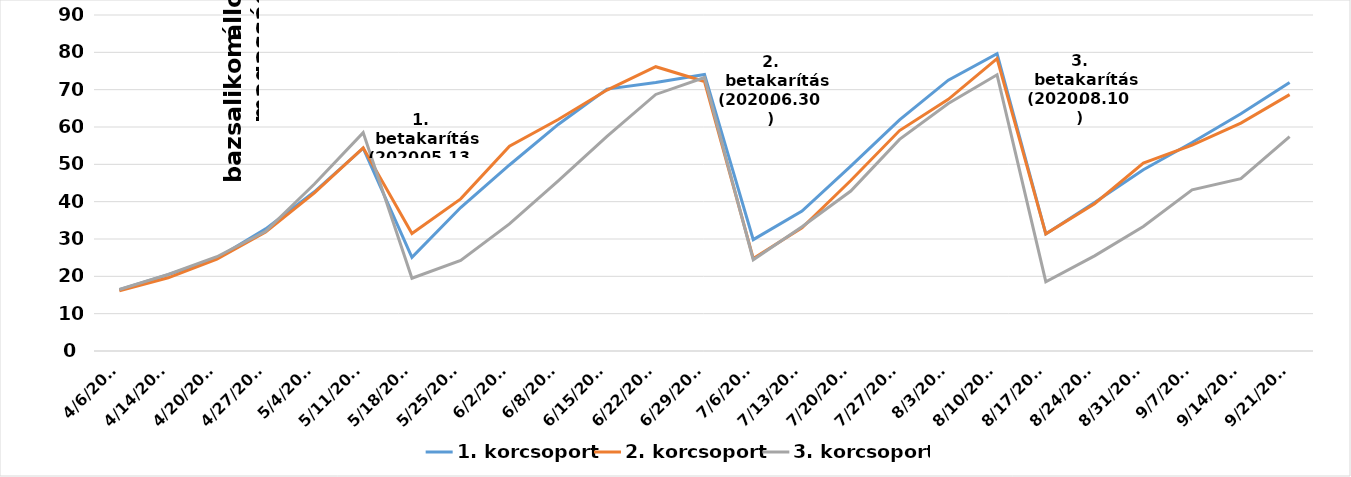
| Category | 1. korcsoport | 2. korcsoport | 3. korcsoport |
|---|---|---|---|
| 4/6/20 | 16.415 | 16.102 | 16.463 |
| 4/14/20 | 20.47 | 19.61 | 20.513 |
| 4/20/20 | 24.86 | 24.628 | 25.253 |
| 4/27/20 | 32.72 | 31.862 | 32.045 |
| 5/4/20 | 42.643 | 42.345 | 44.72 |
| 5/11/20 | 54.33 | 54.427 | 58.487 |
| 5/18/20 | 25.088 | 31.46 | 19.488 |
| 5/25/20 | 38.425 | 40.753 | 24.262 |
| 6/2/20 | 49.828 | 54.85 | 34.052 |
| 6/8/20 | 60.682 | 61.998 | 45.575 |
| 6/15/20 | 70.16 | 69.902 | 57.47 |
| 6/22/20 | 71.915 | 76.15 | 68.718 |
| 6/29/20 | 74.088 | 72.18 | 73.242 |
| 7/6/20 | 29.825 | 24.8 | 24.45 |
| 7/13/20 | 37.468 | 33.018 | 33.278 |
| 7/20/20 | 49.5 | 45.675 | 42.85 |
| 7/27/20 | 61.9 | 59.05 | 56.675 |
| 8/3/20 | 72.535 | 67.425 | 66.305 |
| 8/10/20 | 79.643 | 78.305 | 73.983 |
| 8/17/20 | 31.342 | 31.385 | 18.558 |
| 8/24/20 | 39.808 | 39.457 | 25.475 |
| 8/31/20 | 48.555 | 50.358 | 33.367 |
| 9/7/20 | 55.852 | 55.125 | 43.157 |
| 9/14/20 | 63.545 | 61.06 | 46.145 |
| 9/21/20 | 71.932 | 68.68 | 57.42 |